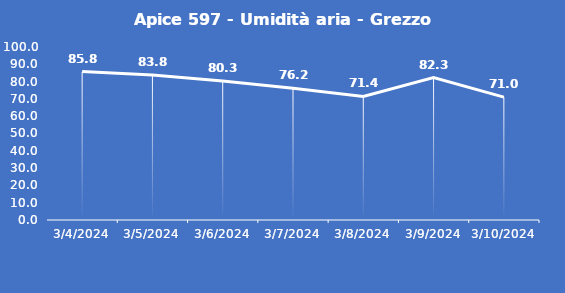
| Category | Apice 597 - Umidità aria - Grezzo (%) |
|---|---|
| 3/4/24 | 85.8 |
| 3/5/24 | 83.8 |
| 3/6/24 | 80.3 |
| 3/7/24 | 76.2 |
| 3/8/24 | 71.4 |
| 3/9/24 | 82.3 |
| 3/10/24 | 71 |